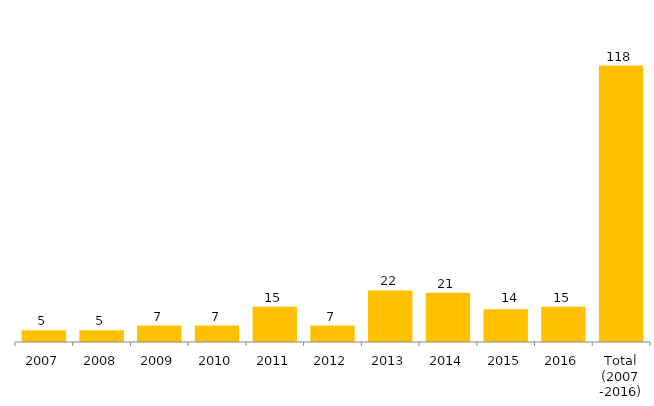
| Category | Total Geral |
|---|---|
| 2007 | 5 |
| 2008 | 5 |
| 2009 | 7 |
| 2010 | 7 |
| 2011 | 15 |
| 2012 | 7 |
| 2013 | 22 |
| 2014 | 21 |
| 2015 | 14 |
| 2016 | 15 |
| Total (2007 -2016) | 118 |